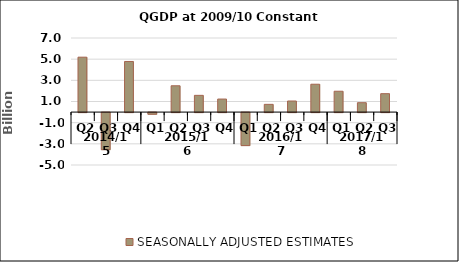
| Category | SEASONALLY ADJUSTED ESTIMATES |
|---|---|
| 0 | 5.188 |
| 1 | -3.504 |
| 2 | 4.782 |
| 3 | -0.155 |
| 4 | 2.485 |
| 5 | 1.582 |
| 6 | 1.231 |
| 7 | -3.118 |
| 8 | 0.73 |
| 9 | 1.047 |
| 10 | 2.633 |
| 11 | 1.969 |
| 12 | 0.887 |
| 13 | 1.74 |